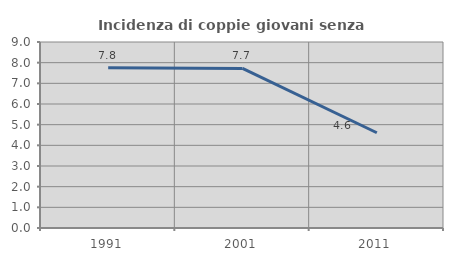
| Category | Incidenza di coppie giovani senza figli |
|---|---|
| 1991.0 | 7.751 |
| 2001.0 | 7.723 |
| 2011.0 | 4.61 |